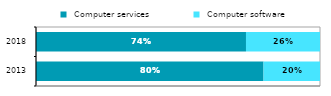
| Category |  Computer services |  Computer software |
|---|---|---|
| 2013 | 0.801 | 0.199 |
| 2018 | 0.739 | 0.261 |